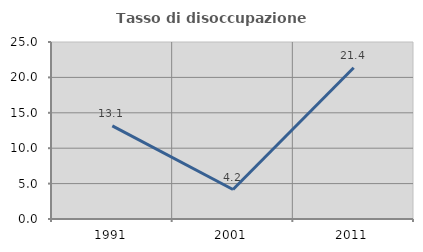
| Category | Tasso di disoccupazione giovanile  |
|---|---|
| 1991.0 | 13.143 |
| 2001.0 | 4.167 |
| 2011.0 | 21.354 |